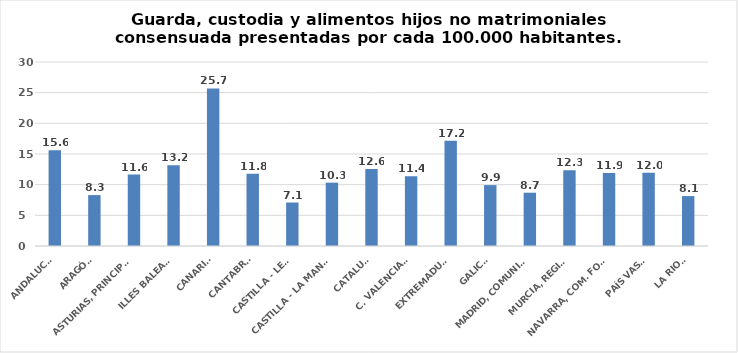
| Category | Series 0 |
|---|---|
| ANDALUCÍA | 15.597 |
| ARAGÓN | 8.3 |
| ASTURIAS, PRINCIPADO | 11.648 |
| ILLES BALEARS | 13.177 |
| CANARIAS | 25.684 |
| CANTABRIA | 11.79 |
| CASTILLA - LEÓN | 7.088 |
| CASTILLA - LA MANCHA | 10.33 |
| CATALUÑA | 12.553 |
| C. VALENCIANA | 11.354 |
| EXTREMADURA | 17.169 |
| GALICIA | 9.929 |
| MADRID, COMUNIDAD | 8.689 |
| MURCIA, REGIÓN | 12.341 |
| NAVARRA, COM. FORAL | 11.905 |
| PAÍS VASCO | 11.961 |
| LA RIOJA | 8.138 |